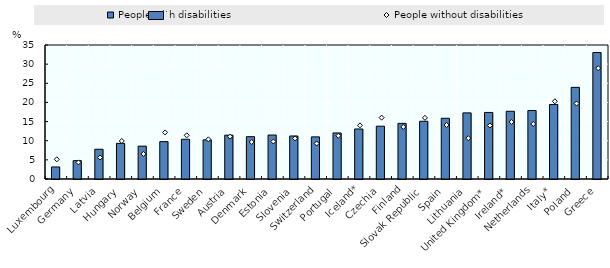
| Category | People with disabilities |
|---|---|
| Luxembourg | 3.146 |
| Germany | 4.796 |
| Latvia | 7.77 |
| Hungary | 9.302 |
| Norway | 8.582 |
| Belgium | 9.762 |
| France | 10.382 |
| Sweden | 10.217 |
| Austria | 11.455 |
| Denmark | 11.053 |
| Estonia | 11.482 |
| Slovenia | 11.239 |
| Switzerland | 11.002 |
| Portugal | 12.024 |
| Iceland* | 13.064 |
| Czechia | 13.793 |
| Finland | 14.528 |
| Slovak Republic | 15.076 |
| Spain | 15.858 |
| Lithuania | 17.264 |
| United Kingdom* | 17.384 |
| Ireland* | 17.686 |
| Netherlands | 17.882 |
| Italy*  | 19.469 |
| Poland | 23.936 |
| Greece | 33.035 |